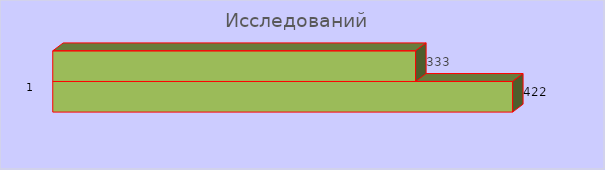
| Category | исследований |
|---|---|
| 0 | 333 |